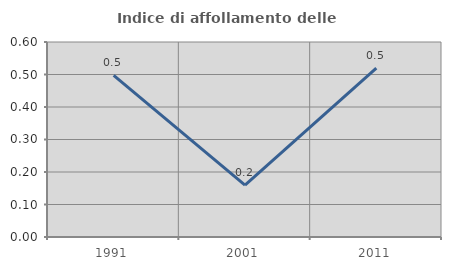
| Category | Indice di affollamento delle abitazioni  |
|---|---|
| 1991.0 | 0.498 |
| 2001.0 | 0.159 |
| 2011.0 | 0.52 |